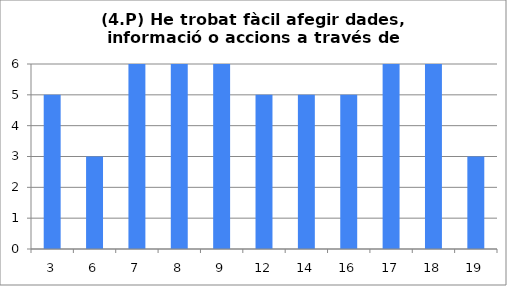
| Category | 4 |
|---|---|
| 3.0 | 5 |
| 6.0 | 3 |
| 7.0 | 6 |
| 8.0 | 6 |
| 9.0 | 6 |
| 12.0 | 5 |
| 14.0 | 5 |
| 16.0 | 5 |
| 17.0 | 6 |
| 18.0 | 6 |
| 19.0 | 3 |